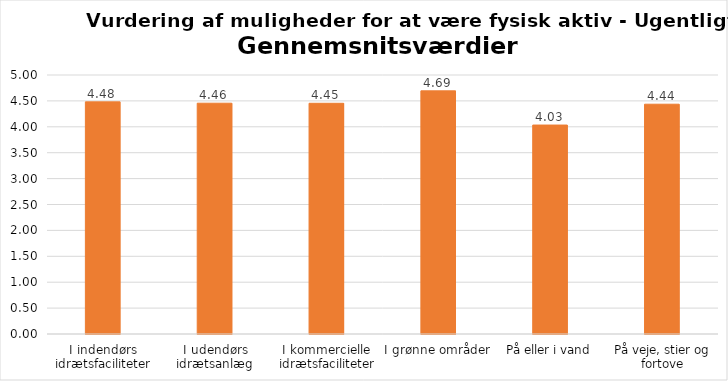
| Category | Gennemsnit |
|---|---|
| I indendørs idrætsfaciliteter | 4.481 |
| I udendørs idrætsanlæg | 4.455 |
| I kommercielle idrætsfaciliteter | 4.454 |
| I grønne områder | 4.694 |
| På eller i vand | 4.034 |
| På veje, stier og fortove | 4.436 |